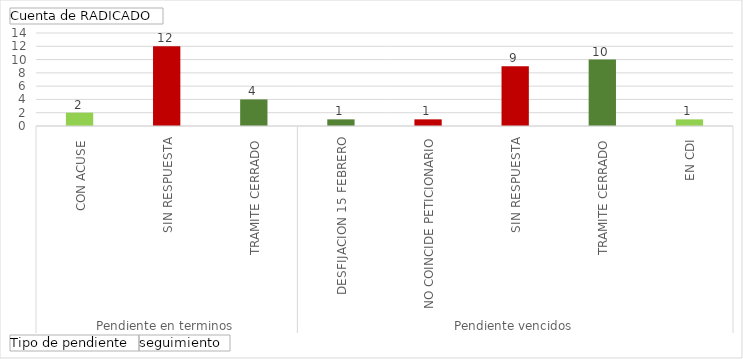
| Category | Total |
|---|---|
| 0 | 2 |
| 1 | 12 |
| 2 | 4 |
| 3 | 1 |
| 4 | 1 |
| 5 | 9 |
| 6 | 10 |
| 7 | 1 |